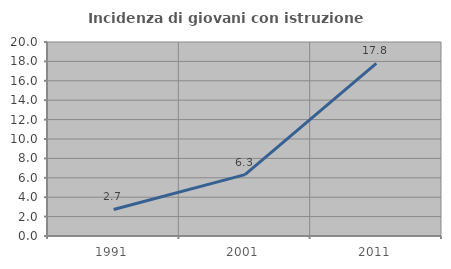
| Category | Incidenza di giovani con istruzione universitaria |
|---|---|
| 1991.0 | 2.734 |
| 2001.0 | 6.332 |
| 2011.0 | 17.801 |